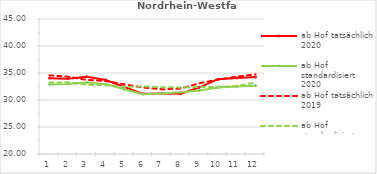
| Category | ab Hof tatsächlich 2020 | ab Hof standardisiert 2020 | ab Hof tatsächlich 2019 | ab Hof standardisiert 2019 |
|---|---|---|---|---|
| 0 | 34.036 | 32.893 | 34.557 | 33.257 |
| 1 | 33.926 | 32.948 | 34.316 | 33.266 |
| 2 | 34.303 | 33.25 | 33.725 | 32.846 |
| 3 | 33.72 | 32.937 | 33.518 | 32.76 |
| 4 | 32.4 | 31.994 | 32.888 | 32.423 |
| 5 | 31.145 | 31.086 | 32.32 | 32.523 |
| 6 | 31.184 | 31.205 | 31.992 | 32.375 |
| 7 | 31.148 | 31.453 | 32.118 | 32.331 |
| 8 | 32.343 | 31.74 | 33.102 | 32.407 |
| 9 | 33.858 | 32.295 | 33.786 | 32.441 |
| 10 | 34.056 | 32.505 | 34.329 | 32.58 |
| 11 | 34.239 | 32.65 | 34.751 | 33.234 |